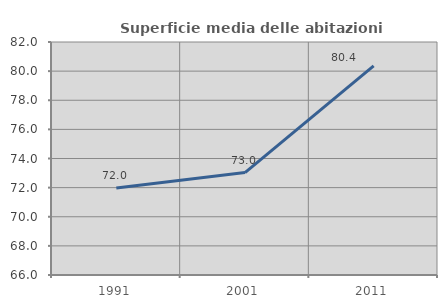
| Category | Superficie media delle abitazioni occupate |
|---|---|
| 1991.0 | 71.979 |
| 2001.0 | 73.035 |
| 2011.0 | 80.361 |